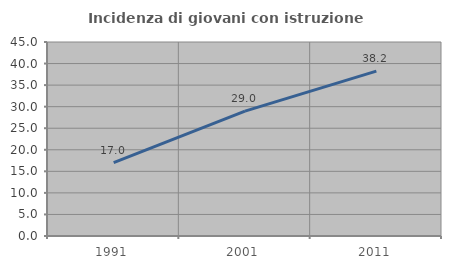
| Category | Incidenza di giovani con istruzione universitaria |
|---|---|
| 1991.0 | 17.001 |
| 2001.0 | 28.971 |
| 2011.0 | 38.244 |